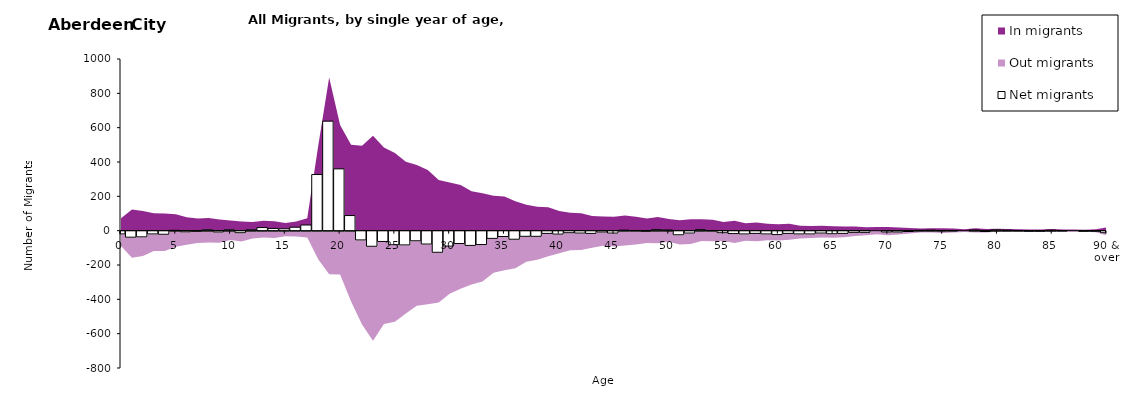
| Category |  Net migrants |
|---|---|
| 0 | -16 |
| 1 | -35 |
| 2 | -33 |
| 3 | -16 |
| 4 | -18 |
| 5 | 2 |
| 6 | -4 |
| 7 | -1 |
| 8 | 5 |
| 9 | -5 |
| 10 | 5 |
| 11 | -9 |
| 12 | 5 |
| 13 | 18 |
| 14 | 13 |
| 15 | 11 |
| 16 | 20 |
| 17 | 33 |
| 18 | 327 |
| 19 | 638 |
| 20 | 360 |
| 21 | 88 |
| 22 | -51 |
| 23 | -88 |
| 24 | -60 |
| 25 | -79 |
| 26 | -80 |
| 27 | -56 |
| 28 | -75 |
| 29 | -123 |
| 30 | -87 |
| 31 | -72 |
| 32 | -83 |
| 33 | -78 |
| 34 | -42 |
| 35 | -31 |
| 36 | -47 |
| 37 | -30 |
| 38 | -30 |
| 39 | -13 |
| 40 | -17 |
| 41 | -9 |
| 42 | -11 |
| 43 | -13 |
| 44 | -5 |
| 45 | -11 |
| 46 | 3 |
| 47 | 1 |
| 48 | -1 |
| 49 | 6 |
| 50 | 4 |
| 51 | -21 |
| 52 | -11 |
| 53 | 6 |
| 54 | 1 |
| 55 | -9 |
| 56 | -14 |
| 57 | -16 |
| 58 | -13 |
| 59 | -16 |
| 60 | -20 |
| 61 | -13 |
| 62 | -16 |
| 63 | -16 |
| 64 | -11 |
| 65 | -15 |
| 66 | -13 |
| 67 | -7 |
| 68 | -7 |
| 69 | 0 |
| 70 | -5 |
| 71 | -5 |
| 72 | -2 |
| 73 | 2 |
| 74 | 3 |
| 75 | 1 |
| 76 | 1 |
| 77 | 0 |
| 78 | 4 |
| 79 | -2 |
| 80 | 5 |
| 81 | 3 |
| 82 | 1 |
| 83 | -1 |
| 84 | -1 |
| 85 | 3 |
| 86 | 1 |
| 87 | 0 |
| 88 | -1 |
| 89 | -1 |
| 90 & over | -9 |